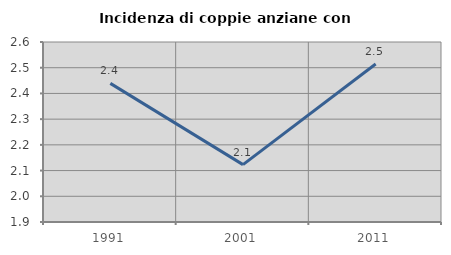
| Category | Incidenza di coppie anziane con figli |
|---|---|
| 1991.0 | 2.439 |
| 2001.0 | 2.123 |
| 2011.0 | 2.515 |